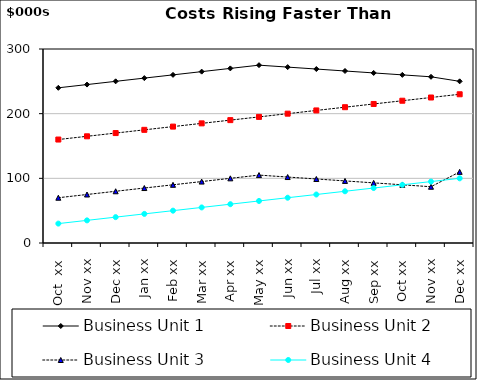
| Category | Business Unit 1 | Business Unit 2 | Business Unit 3 | Business Unit 4 |
|---|---|---|---|---|
| Oct  xx | 240 | 160 | 70 | 30 |
| Nov xx | 245 | 165 | 75 | 35 |
| Dec xx | 250 | 170 | 80 | 40 |
| Jan xx | 255 | 175 | 85 | 45 |
| Feb xx | 260 | 180 | 90 | 50 |
| Mar xx | 265 | 185 | 95 | 55 |
| Apr xx | 270 | 190 | 100 | 60 |
| May xx | 275 | 195 | 105 | 65 |
| Jun xx | 272 | 200 | 102 | 70 |
| Jul xx | 269 | 205 | 99 | 75 |
| Aug xx | 266 | 210 | 96 | 80 |
| Sep xx | 263 | 215 | 93 | 85 |
| Oct xx | 260 | 220 | 90 | 90 |
| Nov xx | 257 | 225 | 87 | 95 |
| Dec xx | 250 | 230 | 110 | 100 |